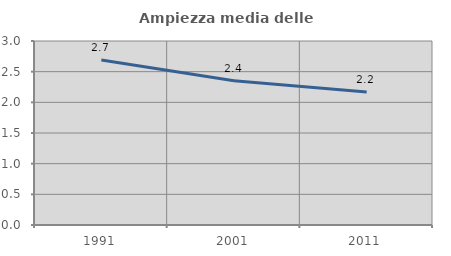
| Category | Ampiezza media delle famiglie |
|---|---|
| 1991.0 | 2.691 |
| 2001.0 | 2.353 |
| 2011.0 | 2.167 |